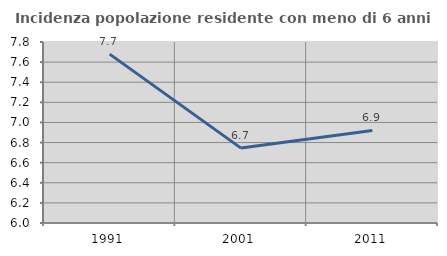
| Category | Incidenza popolazione residente con meno di 6 anni |
|---|---|
| 1991.0 | 7.68 |
| 2001.0 | 6.745 |
| 2011.0 | 6.92 |